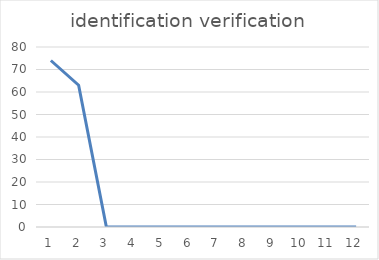
| Category | identification verification |
|---|---|
| 0 | 74 |
| 1 | 63 |
| 2 | 0 |
| 3 | 0 |
| 4 | 0 |
| 5 | 0 |
| 6 | 0 |
| 7 | 0 |
| 8 | 0 |
| 9 | 0 |
| 10 | 0 |
| 11 | 0 |